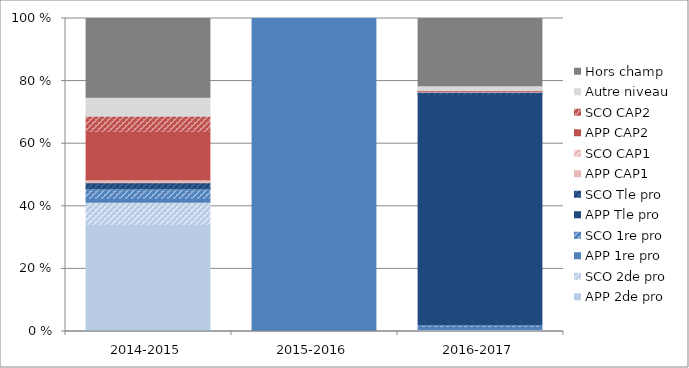
| Category | APP 2de pro | SCO 2de pro | APP 1re pro | SCO 1re pro | APP Tle pro | SCO Tle pro | APP CAP1 | SCO CAP1 | APP CAP2 | SCO CAP2 | Autre niveau | Hors champ |
|---|---|---|---|---|---|---|---|---|---|---|---|---|
| 2014-2015 | 34.28 | 6.66 | 1.61 | 2.64 | 0.56 | 1.75 | 0.87 | 0.09 | 15.43 | 4.88 | 6.09 | 25.12 |
| 2015-2016 | 0 | 0 | 100 | 0 | 0 | 0 | 0 | 0 | 0 | 0 | 0 | 0 |
| 2016-2017 | 0.27 | 0.01 | 1.34 | 0.13 | 74.14 | 0.58 | 0.28 | 0.01 | 0.22 | 0.01 | 1.55 | 21.47 |